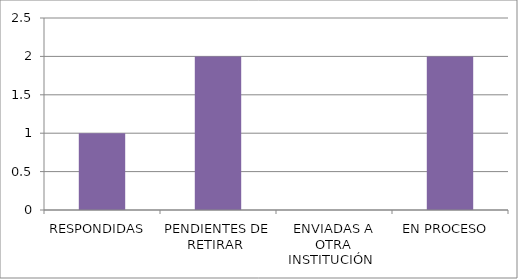
| Category | Series 0 |
|---|---|
| RESPONDIDAS  | 1 |
| PENDIENTES DE RETIRAR  | 2 |
| ENVIADAS A OTRA INSTITUCIÓN  | 0 |
| EN PROCESO  | 2 |